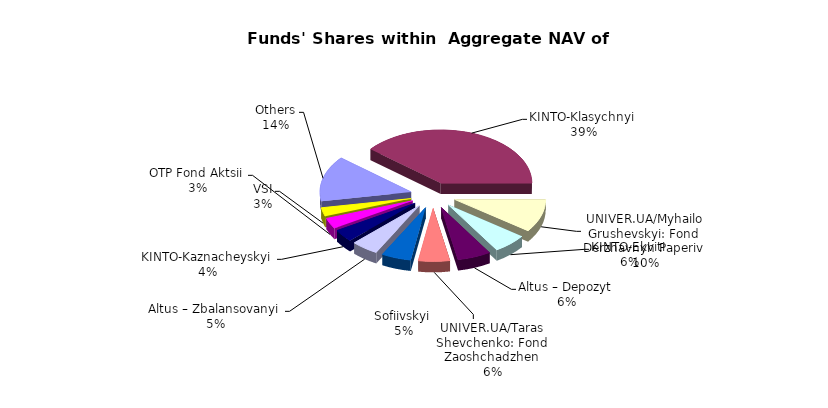
| Category | Series 0 | Series 1 |
|---|---|---|
| Others | 7540662.94 | 0.138 |
| KINTO-Klasychnyi | 21223288.516 | 0.389 |
| UNIVER.UA/Myhailo Grushevskyi: Fond Derzhavnyh Paperiv | 5497358.38 | 0.101 |
| KINTO-Ekviti | 3294552.77 | 0.06 |
| Altus – Depozyt | 3243393.9 | 0.059 |
| UNIVER.UA/Taras Shevchenko: Fond Zaoshchadzhen | 3039680.99 | 0.056 |
| Sofiivskyi | 2856847.986 | 0.052 |
| Altus – Zbalansovanyi | 2617932.1 | 0.048 |
| KINTO-Kaznacheyskyi | 2034560.61 | 0.037 |
| OTP Fond Aktsii | 1754711.06 | 0.032 |
| VSI | 1426704.77 | 0.026 |